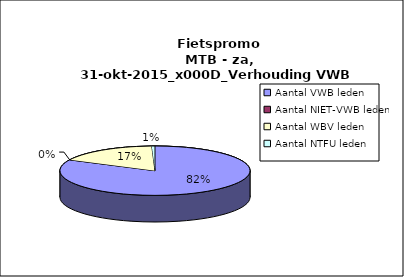
| Category | Series 0 |
|---|---|
| Aantal VWB leden | 301 |
| Aantal NIET-VWB leden | 0 |
| Aantal WBV leden | 63 |
| Aantal NTFU leden | 2 |